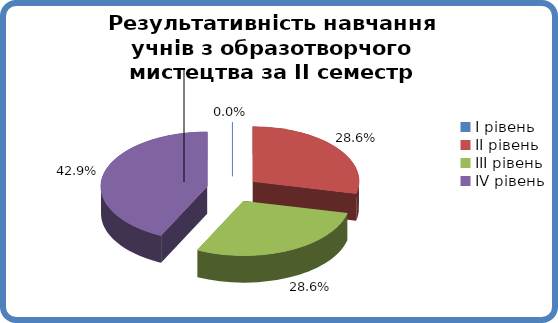
| Category | Series 0 |
|---|---|
| 0 | 0 |
| 1 | 0.286 |
| 2 | 0.286 |
| 3 | 0.429 |